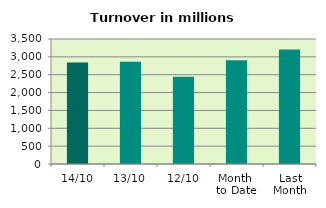
| Category | Series 0 |
|---|---|
| 14/10 | 2839.576 |
| 13/10 | 2862.961 |
| 12/10 | 2443.637 |
| Month 
to Date | 2905.129 |
| Last
Month | 3204.516 |